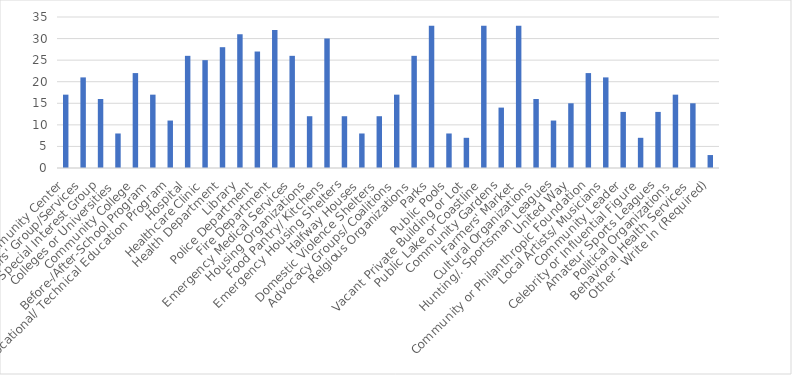
| Category | Number of Responses |
|---|---|
| Community Center | 17 |
| Seniors' Group/Services | 21 |
| Special Interest Group | 16 |
| Colleges or Universities | 8 |
| Community College | 22 |
| Before-/After-School Program | 17 |
| Vocational/ Technical Education Program | 11 |
| Hospital | 26 |
| Healthcare Clinic | 25 |
| Health Department | 28 |
| Library | 31 |
| Police Department | 27 |
| Fire Department | 32 |
| Emergency Medical Services | 26 |
| Housing Organizations | 12 |
| Food Pantry/ Kitchens | 30 |
| Emergency Housing Shelters | 12 |
| Halfway Houses | 8 |
| Domestic Violence Shelters | 12 |
| Advocacy Groups/ Coalitions | 17 |
| Relgious Organizations | 26 |
| Parks | 33 |
| Public Pools | 8 |
| Vacant Private Building or Lot | 7 |
| Public Lake or Coastline | 33 |
| Community Gardens | 14 |
| Farmers' Market | 33 |
| Cultural Organizations | 16 |
| Hunting/. Sportsman Leagues | 11 |
| United Way | 15 |
| Community or Philanthropic Foundation | 22 |
| Local Artists/ Musicians | 21 |
| Community Leader | 13 |
| Celebrity or Influential Figure | 7 |
| Amateur Sports Leagues | 13 |
| Political Organizations | 17 |
| Behavioral Health Services | 15 |
| Other - Write In (Required) | 3 |